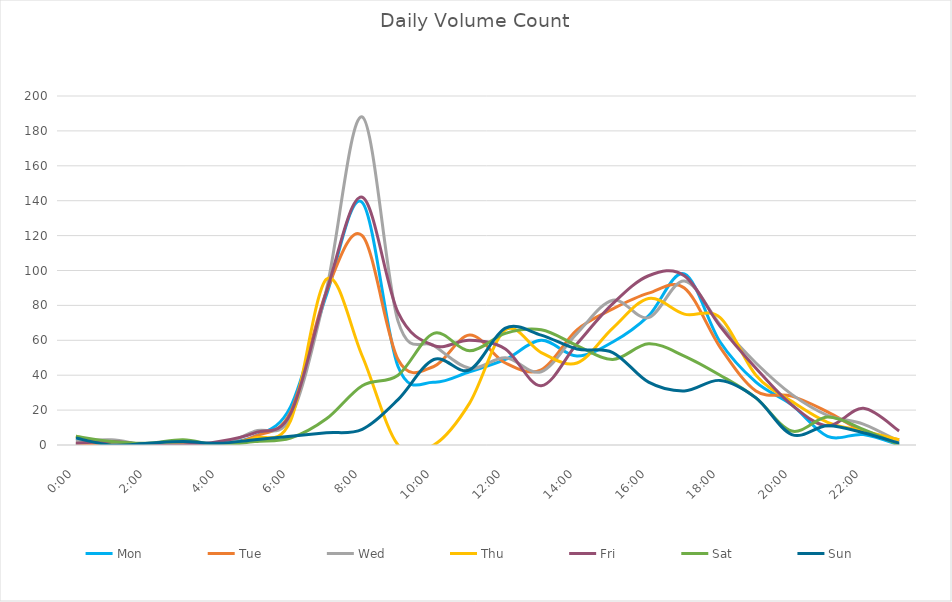
| Category | Mon | Tue | Wed | Thu | Fri | Sat | Sun |
|---|---|---|---|---|---|---|---|
| 0.0 | 0 | 1 | 2 | 5 | 1 | 5 | 4 |
| 0.0416666666666667 | 2 | 0 | 3 | 0 | 2 | 2 | 0 |
| 0.0833333333333333 | 0 | 0 | 0 | 0 | 0 | 1 | 1 |
| 0.125 | 0 | 2 | 1 | 0 | 0 | 3 | 2 |
| 0.166666666666667 | 1 | 0 | 0 | 0 | 2 | 0 | 1 |
| 0.208333333333333 | 5 | 5 | 8 | 4 | 7 | 2 | 3 |
| 0.25 | 22 | 19 | 16 | 14 | 18 | 4 | 5 |
| 0.291666666666667 | 86 | 88 | 89 | 95 | 88 | 15 | 7 |
| 0.333333333333333 | 139 | 120 | 188 | 51 | 142 | 34 | 9 |
| 0.375 | 45 | 49 | 71 | 0 | 76 | 40 | 26 |
| 0.416666666666667 | 36 | 45 | 57 | 0 | 57 | 64 | 49 |
| 0.4583333333333333 | 42 | 63 | 44 | 24 | 60 | 54 | 43 |
| 0.5 | 49 | 47 | 50 | 66 | 55 | 64 | 67 |
| 0.541666666666667 | 60 | 43 | 42 | 53 | 34 | 66 | 63 |
| 0.5833333333333334 | 51 | 66 | 64 | 47 | 58 | 57 | 55 |
| 0.625 | 59 | 78 | 83 | 67 | 81 | 49 | 53 |
| 0.666666666666667 | 74 | 87 | 73 | 84 | 97 | 58 | 36 |
| 0.7083333333333334 | 98 | 90 | 94 | 75 | 97 | 51 | 31 |
| 0.75 | 59 | 56 | 69 | 73 | 68 | 40 | 37 |
| 0.791666666666667 | 36 | 31 | 47 | 40 | 44 | 27 | 27 |
| 0.8333333333333334 | 23 | 28 | 29 | 25 | 23 | 8 | 6 |
| 0.875 | 5 | 19 | 17 | 13 | 11 | 16 | 11 |
| 0.916666666666667 | 6 | 8 | 12 | 8 | 21 | 9 | 7 |
| 0.9583333333333334 | 0 | 3 | 2 | 3 | 8 | 0 | 1 |